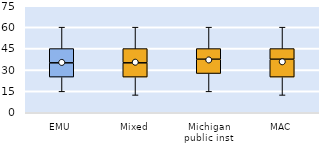
| Category | 25th | 50th | 75th |
|---|---|---|---|
| EMU | 25 | 10 | 10 |
| Mixed | 25 | 10 | 10 |
| Michigan public inst | 27.5 | 10 | 7.5 |
| MAC | 25 | 12.5 | 7.5 |